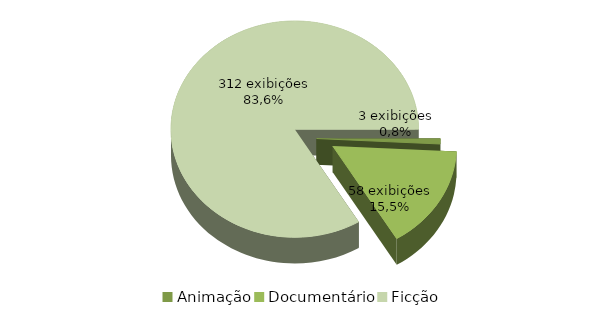
| Category | Series 0 |
|---|---|
| Animação | 3 |
| Documentário | 58 |
| Ficção | 312 |